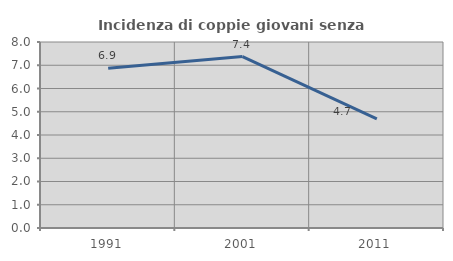
| Category | Incidenza di coppie giovani senza figli |
|---|---|
| 1991.0 | 6.873 |
| 2001.0 | 7.376 |
| 2011.0 | 4.689 |